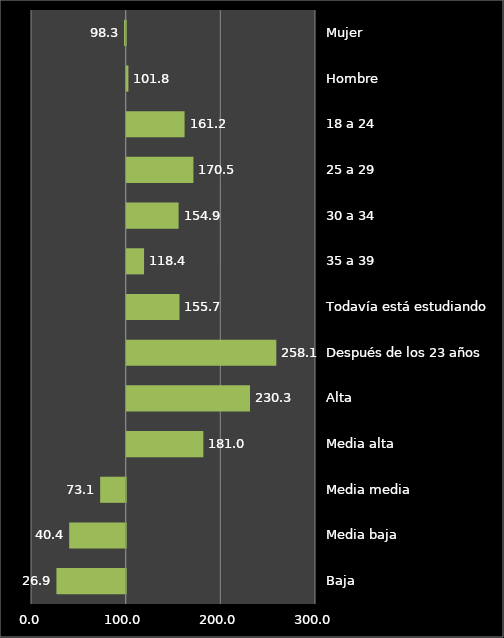
| Category | Series 0 |
|---|---|
| Baja | 26.86 |
| Media baja | 40.351 |
| Media media | 73.055 |
| Media alta | 181.013 |
| Alta | 230.293 |
| Después de los 23 años | 258.086 |
| Todavía está estudiando | 155.745 |
| 35 a 39 | 118.378 |
| 30 a 34 | 154.851 |
| 25 a 29 | 170.495 |
| 18 a 24 | 161.176 |
| Hombre | 101.838 |
| Mujer | 98.275 |